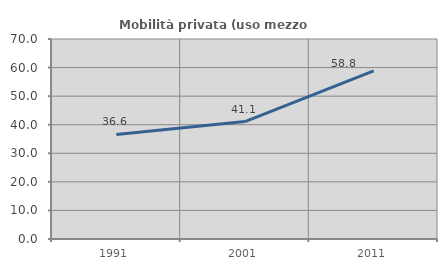
| Category | Mobilità privata (uso mezzo privato) |
|---|---|
| 1991.0 | 36.585 |
| 2001.0 | 41.111 |
| 2011.0 | 58.824 |